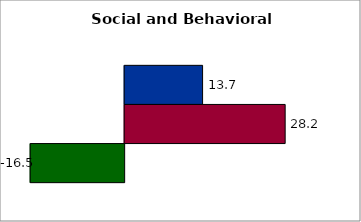
| Category | 50 states and D.C. | SREB states | State |
|---|---|---|---|
| 0 | 13.71 | 28.24 | -16.541 |